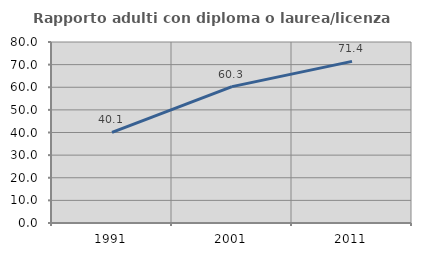
| Category | Rapporto adulti con diploma o laurea/licenza media  |
|---|---|
| 1991.0 | 40.082 |
| 2001.0 | 60.283 |
| 2011.0 | 71.423 |